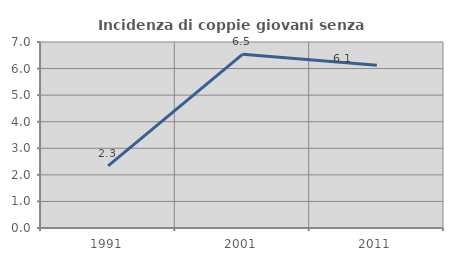
| Category | Incidenza di coppie giovani senza figli |
|---|---|
| 1991.0 | 2.339 |
| 2001.0 | 6.536 |
| 2011.0 | 6.122 |